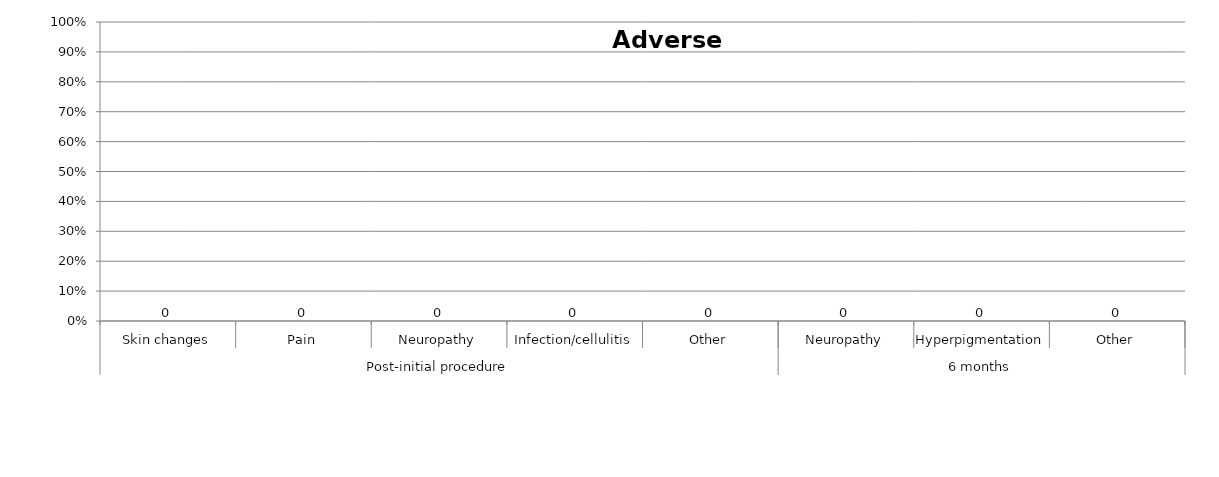
| Category | Series 0 |
|---|---|
| 0 | 0 |
| 1 | 0 |
| 2 | 0 |
| 3 | 0 |
| 4 | 0 |
| 5 | 0 |
| 6 | 0 |
| 7 | 0 |